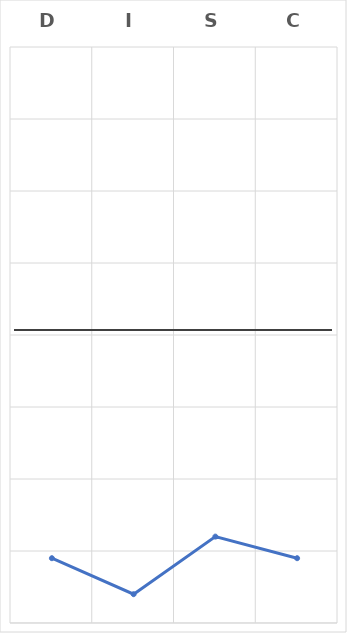
| Category | Series 0 |
|---|---|
| D | 0.9 |
| I | 0.4 |
| S | 1.2 |
| C | 0.9 |